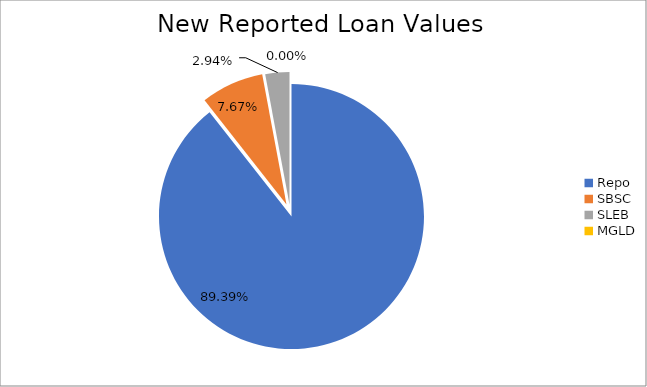
| Category | Series 0 |
|---|---|
| Repo | 11569274.617 |
| SBSC | 992880.33 |
| SLEB | 380128.691 |
| MGLD | 248.746 |